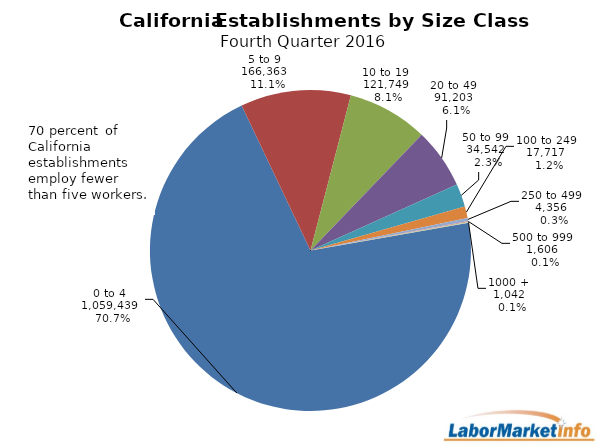
| Category | Series 1 |
|---|---|
| 0 to 4   | 1059439 |
| 5 to 9   | 166363 |
| 10 to 19   | 121749 |
| 20 to 49   | 91203 |
| 50 to 99   | 34542 |
| 100 to 249   | 17717 |
| 250 to 499   | 4356 |
| 500 to 999   | 1606 |
| 1000 +   | 1042 |